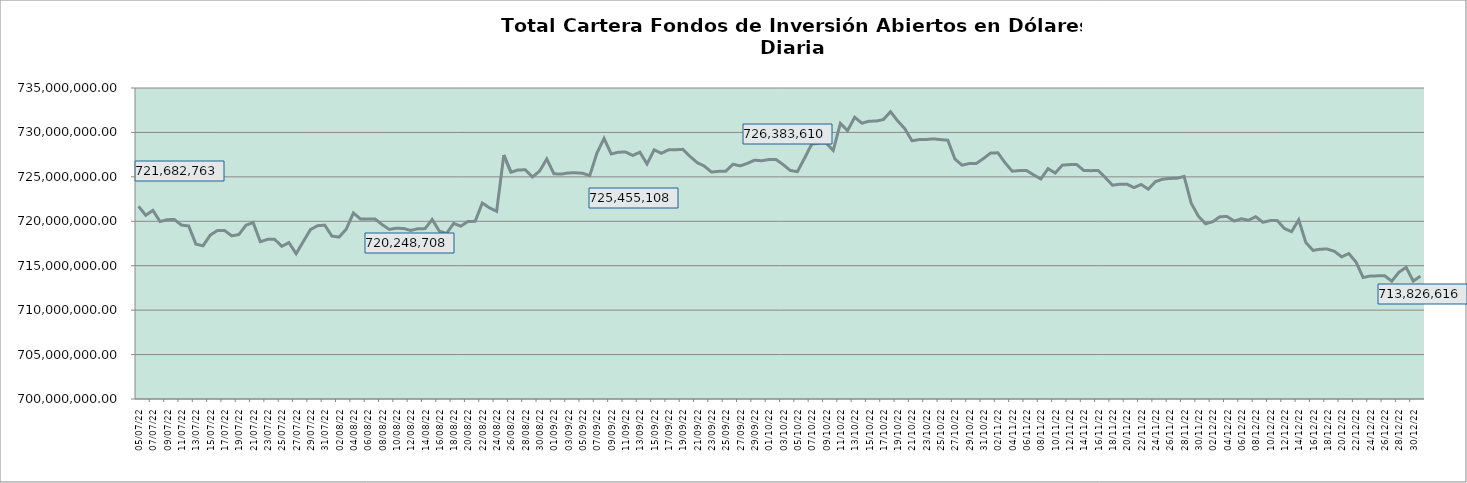
| Category | Cartera |
|---|---|
| 2022-07-05 | 721682763.34 |
| 2022-07-06 | 720679561.41 |
| 2022-07-07 | 721230233.66 |
| 2022-07-08 | 719968162.96 |
| 2022-07-09 | 720184191.04 |
| 2022-07-10 | 720193827.55 |
| 2022-07-11 | 719566839.24 |
| 2022-07-12 | 719470581.76 |
| 2022-07-13 | 717433110.62 |
| 2022-07-14 | 717239189.89 |
| 2022-07-15 | 718441500.03 |
| 2022-07-16 | 718958323.83 |
| 2022-07-17 | 718968004.61 |
| 2022-07-18 | 718360913.52 |
| 2022-07-19 | 718502978.53 |
| 2022-07-20 | 719558821.67 |
| 2022-07-21 | 719862373.34 |
| 2022-07-22 | 717699031.54 |
| 2022-07-23 | 717964129.04 |
| 2022-07-24 | 717973471.65 |
| 2022-07-25 | 717178149.16 |
| 2022-07-26 | 717600335.28 |
| 2022-07-27 | 716351003.88 |
| 2022-07-28 | 717714485.23 |
| 2022-07-29 | 719065038.2 |
| 2022-07-30 | 719504014.08 |
| 2022-07-31 | 719565424.17 |
| 2022-08-01 | 718327704.91 |
| 2022-08-02 | 718223608.84 |
| 2022-08-03 | 719117701.97 |
| 2022-08-04 | 720935241.84 |
| 2022-08-05 | 720248708.33 |
| 2022-08-06 | 720258808.78 |
| 2022-08-07 | 720268613.23 |
| 2022-08-08 | 719631899.94 |
| 2022-08-09 | 719091918.56 |
| 2022-08-10 | 719220276.91 |
| 2022-08-11 | 719189011.43 |
| 2022-08-12 | 718968352.88 |
| 2022-08-13 | 719163960.99 |
| 2022-08-14 | 719174516.8 |
| 2022-08-15 | 720197851.43 |
| 2022-08-16 | 718892008.69 |
| 2022-08-17 | 718628833.35 |
| 2022-08-18 | 719759007.39 |
| 2022-08-19 | 719449799.01 |
| 2022-08-20 | 719982650.36 |
| 2022-08-21 | 719992846.2 |
| 2022-08-22 | 722058841.85 |
| 2022-08-23 | 721511209.74 |
| 2022-08-24 | 721123229.11 |
| 2022-08-25 | 727451506.38 |
| 2022-08-26 | 725517249.67 |
| 2022-08-27 | 725778798.69 |
| 2022-08-28 | 725790579.47 |
| 2022-08-29 | 724986961.02 |
| 2022-08-30 | 725650654.25 |
| 2022-08-31 | 727010924.96 |
| 2022-09-01 | 725348244.05 |
| 2022-09-02 | 725308237.07 |
| 2022-09-03 | 725443427.06 |
| 2022-09-04 | 725455108.15 |
| 2022-09-05 | 725407354.98 |
| 2022-09-06 | 725135780.3 |
| 2022-09-07 | 727668107.61 |
| 2022-09-08 | 729324361.35 |
| 2022-09-09 | 727575787.98 |
| 2022-09-10 | 727774927.5 |
| 2022-09-11 | 727795033.14 |
| 2022-09-12 | 727409004.37 |
| 2022-09-13 | 727776143.96 |
| 2022-09-14 | 726451551.76 |
| 2022-09-15 | 728040729.19 |
| 2022-09-16 | 727650000.99 |
| 2022-09-17 | 728039362.56 |
| 2022-09-18 | 728051977.97 |
| 2022-09-19 | 728097263.02 |
| 2022-09-20 | 727304984.63 |
| 2022-09-21 | 726599243.59 |
| 2022-09-22 | 726212746.45 |
| 2022-09-23 | 725537275.13 |
| 2022-09-24 | 725624111.85 |
| 2022-09-25 | 725636570.96 |
| 2022-09-26 | 726421733.47 |
| 2022-09-27 | 726237702.28 |
| 2022-09-28 | 726510002.62 |
| 2022-09-29 | 726873307.91 |
| 2022-09-30 | 726811273.43 |
| 2022-10-01 | 726948586.96 |
| 2022-10-02 | 726961321.86 |
| 2022-10-03 | 726383610.06 |
| 2022-10-04 | 725717951.25 |
| 2022-10-05 | 725584016.71 |
| 2022-10-06 | 727100631 |
| 2022-10-07 | 728684206.26 |
| 2022-10-08 | 728799731.11 |
| 2022-10-09 | 728812462.25 |
| 2022-10-10 | 727969281.77 |
| 2022-10-11 | 731010183.52 |
| 2022-10-12 | 730198296.61 |
| 2022-10-13 | 731704924.98 |
| 2022-10-14 | 731037772.32 |
| 2022-10-15 | 731266283.82 |
| 2022-10-16 | 731278731.55 |
| 2022-10-17 | 731445274.3 |
| 2022-10-18 | 732332464.9 |
| 2022-10-19 | 731300539.65 |
| 2022-10-20 | 730416006.01 |
| 2022-10-21 | 729060313.94 |
| 2022-10-22 | 729192484 |
| 2022-10-23 | 729205290.03 |
| 2022-10-24 | 729277555.59 |
| 2022-10-25 | 729189326.34 |
| 2022-10-26 | 729123021.29 |
| 2022-10-27 | 727000911.27 |
| 2022-10-28 | 726314301.82 |
| 2022-10-29 | 726499181.39 |
| 2022-10-30 | 726511863.07 |
| 2022-10-31 | 727074330.76 |
| 2022-11-01 | 727690735.35 |
| 2022-11-02 | 727701472.68 |
| 2022-11-03 | 726578868.16 |
| 2022-11-04 | 725637566.12 |
| 2022-11-05 | 725704484.25 |
| 2022-11-06 | 725717282.91 |
| 2022-11-07 | 725214258.2 |
| 2022-11-08 | 724764131.74 |
| 2022-11-09 | 725921974.97 |
| 2022-11-10 | 725430636.26 |
| 2022-11-11 | 726317242.67 |
| 2022-11-12 | 726378290.53 |
| 2022-11-13 | 726391040.98 |
| 2022-11-14 | 725715640.26 |
| 2022-11-15 | 725699114.14 |
| 2022-11-16 | 725710040.09 |
| 2022-11-17 | 724909281.48 |
| 2022-11-18 | 724058874.98 |
| 2022-11-19 | 724168440.26 |
| 2022-11-20 | 724181027.15 |
| 2022-11-21 | 723788257.57 |
| 2022-11-22 | 724141567.2 |
| 2022-11-23 | 723612808.72 |
| 2022-11-24 | 724466294.51 |
| 2022-11-25 | 724731032.73 |
| 2022-11-26 | 724825193.52 |
| 2022-11-27 | 724837467.22 |
| 2022-11-28 | 725051677.66 |
| 2022-11-29 | 722017890.21 |
| 2022-11-30 | 720566612.43 |
| 2022-12-01 | 719716723.63 |
| 2022-12-02 | 719951509.39 |
| 2022-12-03 | 720518097.43 |
| 2022-12-04 | 720530988.68 |
| 2022-12-05 | 720026621.08 |
| 2022-12-06 | 720282960.93 |
| 2022-12-07 | 720119481.18 |
| 2022-12-08 | 720519928.45 |
| 2022-12-09 | 719887458.05 |
| 2022-12-10 | 720074142.15 |
| 2022-12-11 | 720087088.62 |
| 2022-12-12 | 719192634.92 |
| 2022-12-13 | 718826911.89 |
| 2022-12-14 | 720161248.18 |
| 2022-12-15 | 717613833.27 |
| 2022-12-16 | 716723623.56 |
| 2022-12-17 | 716860691.21 |
| 2022-12-18 | 716874925.24 |
| 2022-12-19 | 716613225.38 |
| 2022-12-20 | 715997792.93 |
| 2022-12-21 | 716369753.54 |
| 2022-12-22 | 715419219.55 |
| 2022-12-23 | 713674640.21 |
| 2022-12-24 | 713843657.11 |
| 2022-12-25 | 713858645.86 |
| 2022-12-26 | 713873555.69 |
| 2022-12-27 | 713261986.55 |
| 2022-12-28 | 714262229.51 |
| 2022-12-29 | 714814748.39 |
| 2022-12-30 | 713270447.53 |
| 2022-12-31 | 713826615.85 |